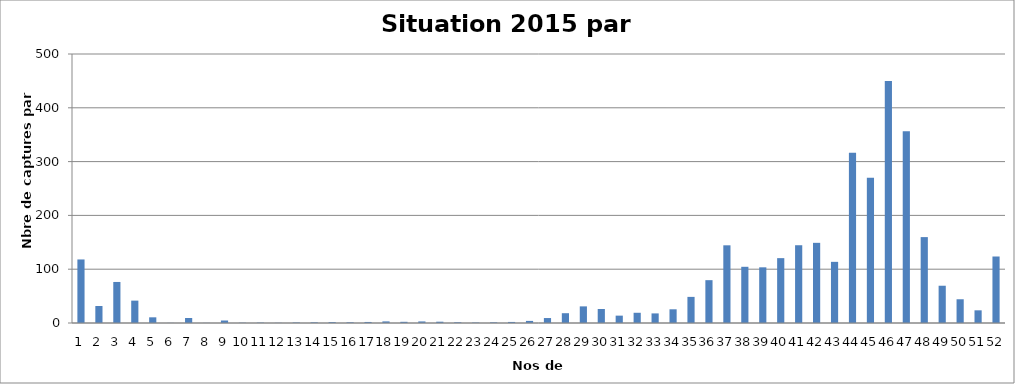
| Category | Series 0 |
|---|---|
| 0 | 118.112 |
| 1 | 31.561 |
| 2 | 76.274 |
| 3 | 41.585 |
| 4 | 10.556 |
| 5 | 0.214 |
| 6 | 9.331 |
| 7 | 0.212 |
| 8 | 4.642 |
| 9 | 0.496 |
| 10 | 0.695 |
| 11 | 0.332 |
| 12 | 0.91 |
| 13 | 1.197 |
| 14 | 1.618 |
| 15 | 1.265 |
| 16 | 1.931 |
| 17 | 2.988 |
| 18 | 2.21 |
| 19 | 2.913 |
| 20 | 2.408 |
| 21 | 1.327 |
| 22 | 0.801 |
| 23 | 1.152 |
| 24 | 1.965 |
| 25 | 3.894 |
| 26 | 9.218 |
| 27 | 18.208 |
| 28 | 30.912 |
| 29 | 26.038 |
| 30 | 13.688 |
| 31 | 19.011 |
| 32 | 17.83 |
| 33 | 25.468 |
| 34 | 48.542 |
| 35 | 79.626 |
| 36 | 144.407 |
| 37 | 104.464 |
| 38 | 103.494 |
| 39 | 120.55 |
| 40 | 144.543 |
| 41 | 149.007 |
| 42 | 113.669 |
| 43 | 316.453 |
| 44 | 269.791 |
| 45 | 449.977 |
| 46 | 356.253 |
| 47 | 159.657 |
| 48 | 69.267 |
| 49 | 44.124 |
| 50 | 23.566 |
| 51 | 123.609 |